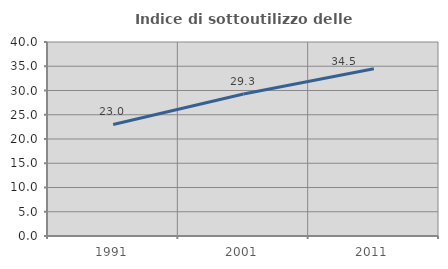
| Category | Indice di sottoutilizzo delle abitazioni  |
|---|---|
| 1991.0 | 22.998 |
| 2001.0 | 29.266 |
| 2011.0 | 34.481 |